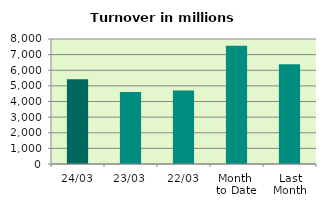
| Category | Series 0 |
|---|---|
| 24/03 | 5418.36 |
| 23/03 | 4603.217 |
| 22/03 | 4709.535 |
| Month 
to Date | 7560.695 |
| Last
Month | 6378.947 |